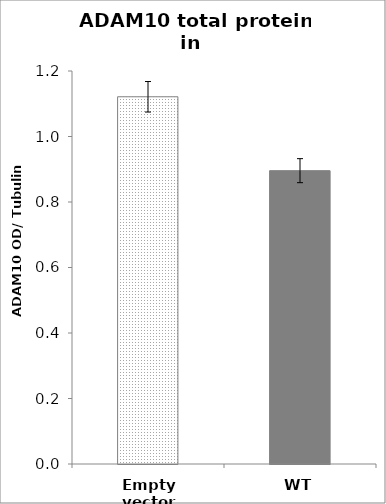
| Category | Series 0 |
|---|---|
| Empty vector | 1.121 |
| WT | 0.896 |